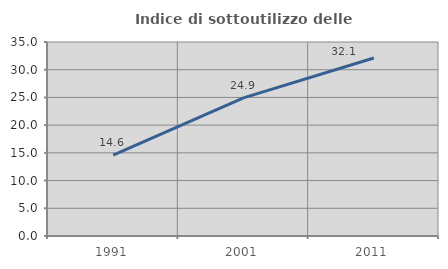
| Category | Indice di sottoutilizzo delle abitazioni  |
|---|---|
| 1991.0 | 14.603 |
| 2001.0 | 24.918 |
| 2011.0 | 32.11 |